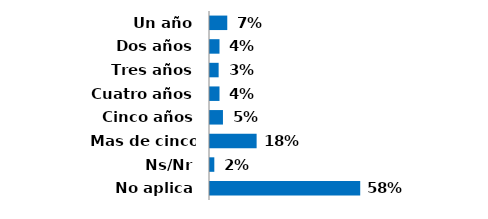
| Category | Series 0 |
|---|---|
| Un año | 0.067 |
| Dos años | 0.037 |
| Tres años | 0.033 |
| Cuatro años | 0.037 |
| Cinco años | 0.05 |
| Mas de cinco años | 0.18 |
| Ns/Nr | 0.017 |
| No aplica | 0.58 |